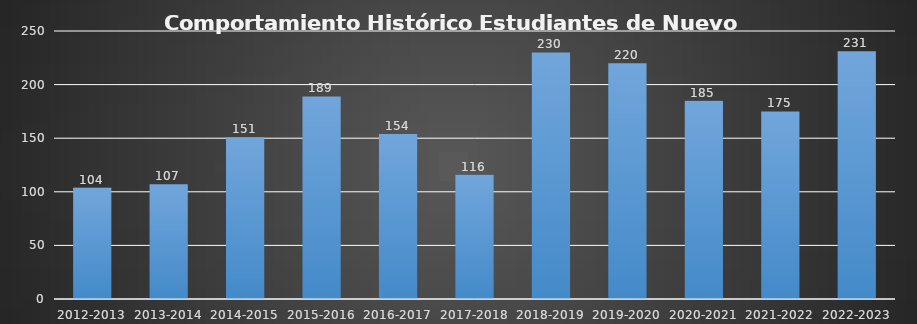
| Category | Series 0 |
|---|---|
| 2012-2013 | 104 |
| 2013-2014 | 107 |
| 2014-2015 | 151 |
| 2015-2016 | 189 |
| 2016-2017 | 154 |
| 2017-2018 | 116 |
| 2018-2019 | 230 |
| 2019-2020 | 220 |
| 2020-2021 | 185 |
| 2021-2022 | 175 |
| 2022-2023 | 231 |